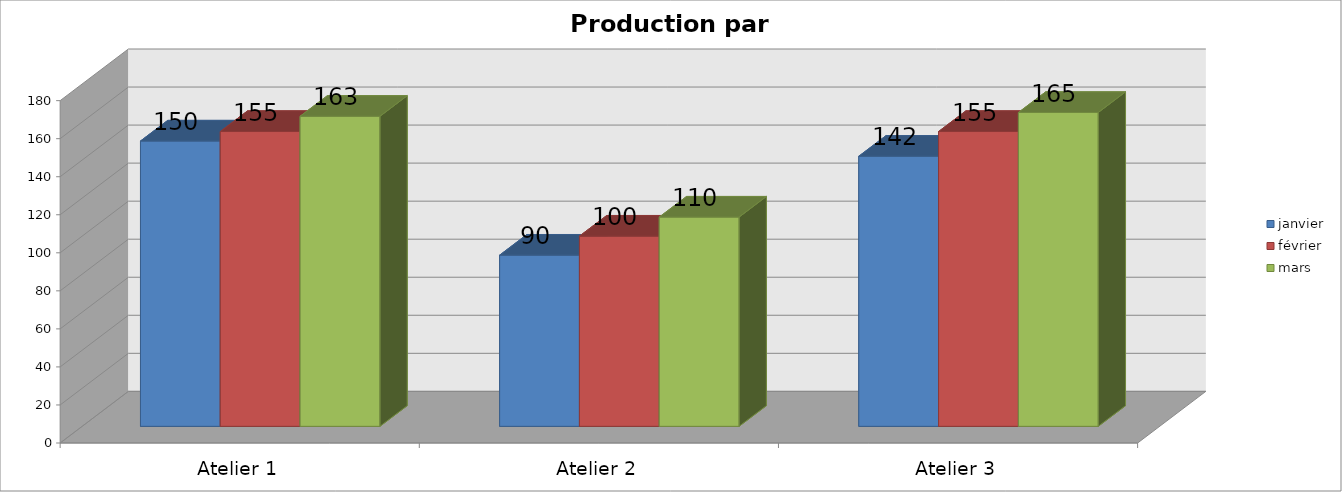
| Category | janvier | février | mars |
|---|---|---|---|
| Atelier 1 | 150 | 155 | 163 |
| Atelier 2 | 90 | 100 | 110 |
| Atelier 3 | 142 | 155 | 165 |